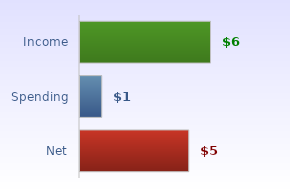
| Category | Series 2 |
|---|---|
| Net | 5 |
| Spending | 1 |
| Income | 6 |